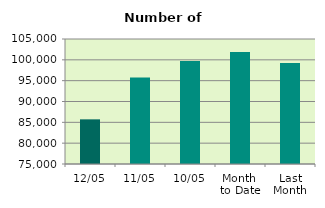
| Category | Series 0 |
|---|---|
| 12/05 | 85716 |
| 11/05 | 95762 |
| 10/05 | 99698 |
| Month 
to Date | 101884 |
| Last
Month | 99222.444 |